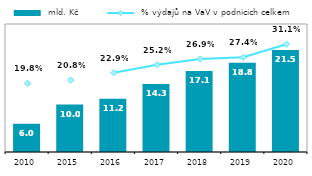
| Category |  mld. Kč |
|---|---|
| 2010.0 | 5.956 |
| 2015.0 | 10 |
| 2016.0 | 11.234 |
| 2017.0 | 14.33 |
| 2018.0 | 17.101 |
| 2019.0 | 18.83 |
| 2020.0 | 21.517 |